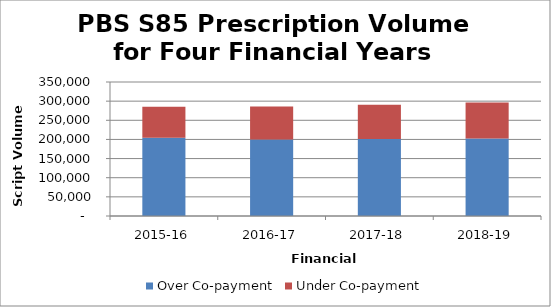
| Category | Over Co‐payment | Under Co‐payment |
|---|---|---|
| 2015-16 | 204073583 | 81430538 |
| 2016-17 | 199784150 | 86196502 |
| 2017-18 | 201430521 | 89435371 |
| 2018-19 | 202275451 | 93863877 |